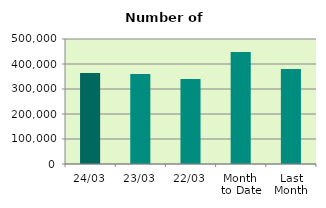
| Category | Series 0 |
|---|---|
| 24/03 | 363594 |
| 23/03 | 359882 |
| 22/03 | 339686 |
| Month 
to Date | 448270 |
| Last
Month | 380345.4 |